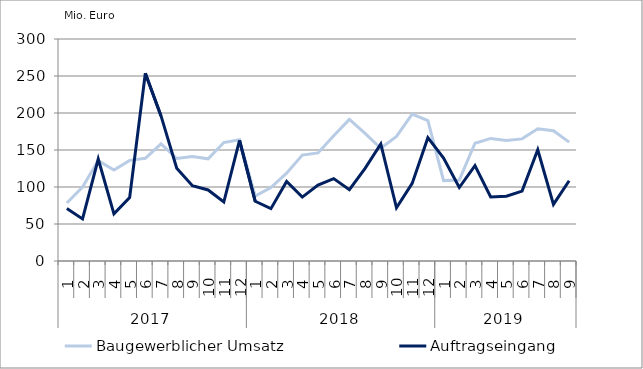
| Category | Baugewerblicher Umsatz | Auftragseingang |
|---|---|---|
| 0 | 78446.78 | 70908.903 |
| 1 | 99841.908 | 56868.408 |
| 2 | 135679.867 | 137790.423 |
| 3 | 123004.403 | 63637.761 |
| 4 | 136010.071 | 85644.63 |
| 5 | 138859.308 | 253791.552 |
| 6 | 158353.879 | 196034.198 |
| 7 | 138510.315 | 125319.873 |
| 8 | 141109.925 | 101690.626 |
| 9 | 138067.098 | 95966.626 |
| 10 | 160064.454 | 79701.993 |
| 11 | 163969.017 | 162878.607 |
| 12 | 87640.529 | 80684.627 |
| 13 | 99259.455 | 70746.763 |
| 14 | 118764.324 | 107538.747 |
| 15 | 143144.178 | 86374.619 |
| 16 | 146070.782 | 102661.329 |
| 17 | 169150.753 | 111287.709 |
| 18 | 191277.885 | 96286.662 |
| 19 | 172425.535 | 125142.495 |
| 20 | 152354.98 | 158112.302 |
| 21 | 168372.756 | 71808.619 |
| 22 | 198558.472 | 104904.147 |
| 23 | 189665.914 | 166653.461 |
| 24 | 108616.605 | 139065.287 |
| 25 | 109331.58 | 99318.609 |
| 26 | 159117.81 | 129002.041 |
| 27 | 165654.287 | 86579.2 |
| 28 | 162976.056 | 87644.362 |
| 29 | 165026.188 | 94463.186 |
| 30 | 178622.938 | 150345.08 |
| 31 | 176074.101 | 76434.317 |
| 32 | 160663.041 | 108444.162 |